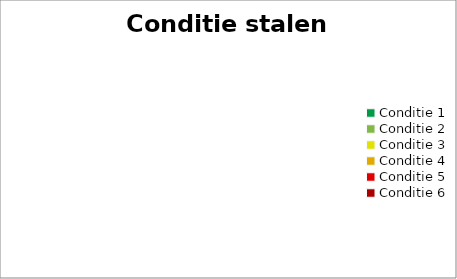
| Category | Conditie stalen kolommen |
|---|---|
| Conditie 1 | 0 |
| Conditie 2 | 0 |
| Conditie 3 | 0 |
| Conditie 4 | 0 |
| Conditie 5 | 0 |
| Conditie 6 | 0 |